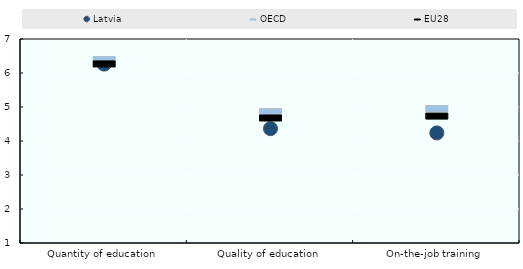
| Category | Latvia | OECD | EU28 |
|---|---|---|---|
| Quantity of education | 6.262 | 6.393 | 6.267 |
| Quality of education | 4.364 | 4.863 | 4.677 |
| On-the-job training | 4.238 | 4.953 | 4.733 |